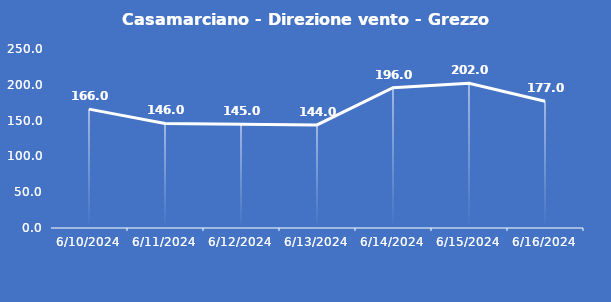
| Category | Casamarciano - Direzione vento - Grezzo (°N) |
|---|---|
| 6/10/24 | 166 |
| 6/11/24 | 146 |
| 6/12/24 | 145 |
| 6/13/24 | 144 |
| 6/14/24 | 196 |
| 6/15/24 | 202 |
| 6/16/24 | 177 |